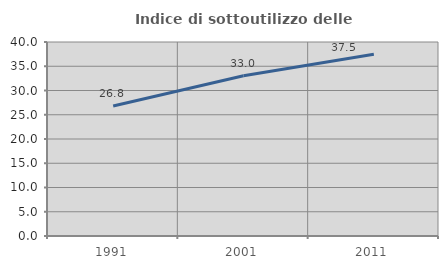
| Category | Indice di sottoutilizzo delle abitazioni  |
|---|---|
| 1991.0 | 26.808 |
| 2001.0 | 33.039 |
| 2011.0 | 37.467 |